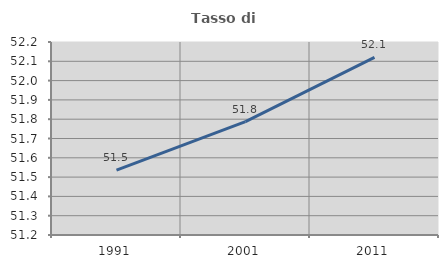
| Category | Tasso di occupazione   |
|---|---|
| 1991.0 | 51.537 |
| 2001.0 | 51.787 |
| 2011.0 | 52.12 |